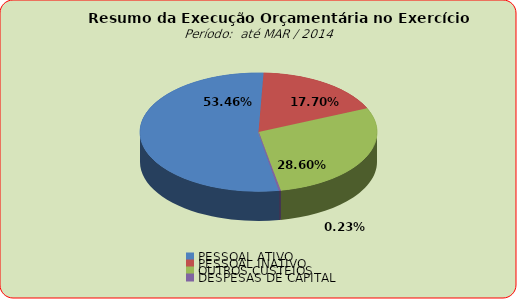
| Category | Series 0 |
|---|---|
| PESSOAL ATIVO | 30106558.42 |
| PESSOAL INATIVO | 9968598.35 |
| OUTROS CUSTEIOS | 16106281 |
| DESPESAS DE CAPITAL | 129625.52 |